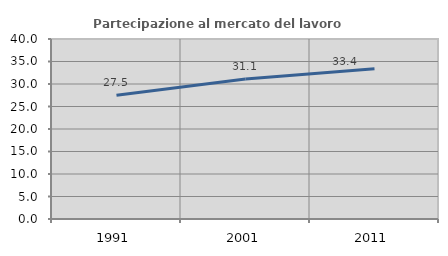
| Category | Partecipazione al mercato del lavoro  femminile |
|---|---|
| 1991.0 | 27.519 |
| 2001.0 | 31.089 |
| 2011.0 | 33.387 |